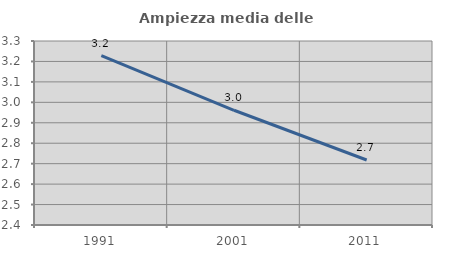
| Category | Ampiezza media delle famiglie |
|---|---|
| 1991.0 | 3.229 |
| 2001.0 | 2.961 |
| 2011.0 | 2.718 |